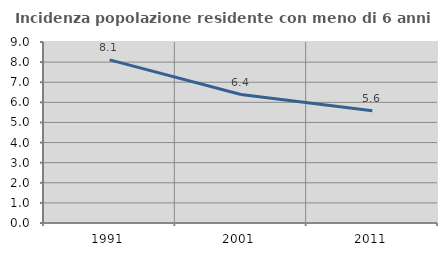
| Category | Incidenza popolazione residente con meno di 6 anni |
|---|---|
| 1991.0 | 8.113 |
| 2001.0 | 6.388 |
| 2011.0 | 5.579 |